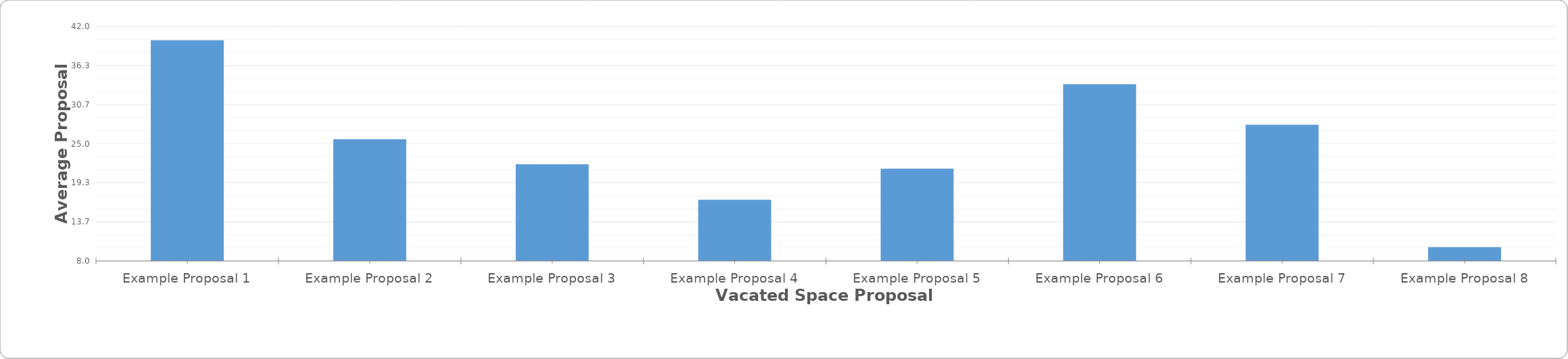
| Category | Series 0 |
|---|---|
| Example Proposal 1 | 40 |
| Example Proposal 2 | 25.625 |
| Example Proposal 3 | 22 |
| Example Proposal 4 | 16.875 |
| Example Proposal 5 | 21.375 |
| Example Proposal 6 | 33.625 |
| Example Proposal 7 | 27.75 |
| Example Proposal 8 | 10 |